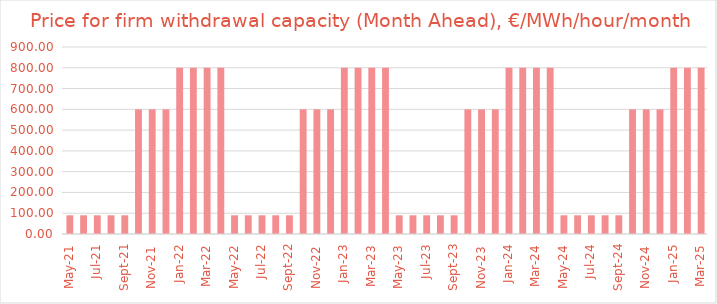
| Category | MA price, €/MWh/hour/month |
|---|---|
| 2021-05-01 | 90 |
| 2021-06-01 | 90 |
| 2021-07-01 | 90 |
| 2021-08-01 | 90 |
| 2021-09-01 | 90 |
| 2021-10-01 | 600 |
| 2021-11-01 | 600 |
| 2021-12-01 | 600 |
| 2022-01-01 | 800 |
| 2022-02-01 | 800 |
| 2022-03-01 | 800 |
| 2022-04-01 | 800 |
| 2022-05-01 | 90 |
| 2022-06-01 | 90 |
| 2022-07-01 | 90 |
| 2022-08-01 | 90 |
| 2022-09-01 | 90 |
| 2022-10-01 | 600 |
| 2022-11-01 | 600 |
| 2022-12-01 | 600 |
| 2023-01-01 | 800 |
| 2023-02-01 | 800 |
| 2023-03-01 | 800 |
| 2023-04-01 | 800 |
| 2023-05-01 | 90 |
| 2023-06-01 | 90 |
| 2023-07-01 | 90 |
| 2023-08-01 | 90 |
| 2023-09-01 | 90 |
| 2023-10-01 | 600 |
| 2023-11-01 | 600 |
| 2023-12-01 | 600 |
| 2024-01-01 | 800 |
| 2024-02-01 | 800 |
| 2024-03-01 | 800 |
| 2024-04-01 | 800 |
| 2024-05-01 | 90 |
| 2024-06-01 | 90 |
| 2024-07-01 | 90 |
| 2024-08-01 | 90 |
| 2024-09-01 | 90 |
| 2024-10-01 | 600 |
| 2024-11-01 | 600 |
| 2024-12-01 | 600 |
| 2025-01-01 | 800 |
| 2025-02-01 | 800 |
| 2025-03-01 | 800 |